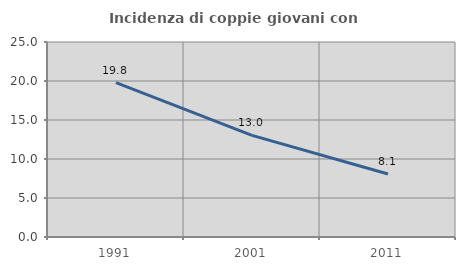
| Category | Incidenza di coppie giovani con figli |
|---|---|
| 1991.0 | 19.78 |
| 2001.0 | 13.029 |
| 2011.0 | 8.075 |